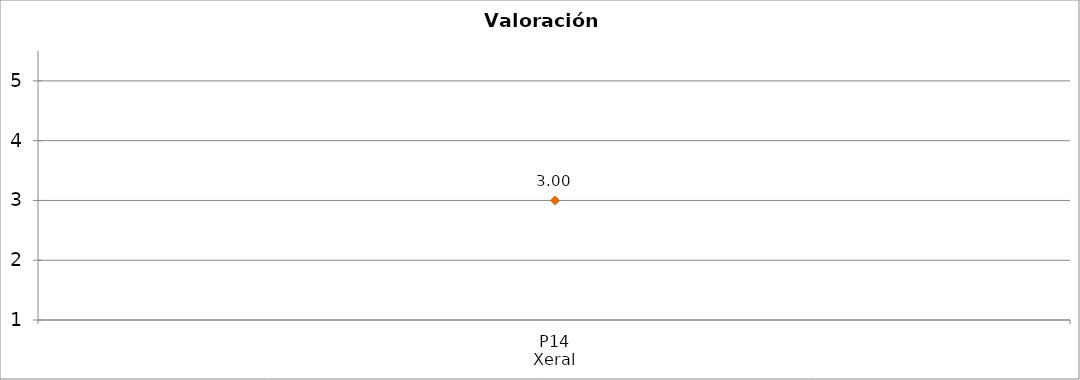
| Category | Valoración (1-5) | MEDIA |
|---|---|---|
| P14
Xeral | 3 | 3 |